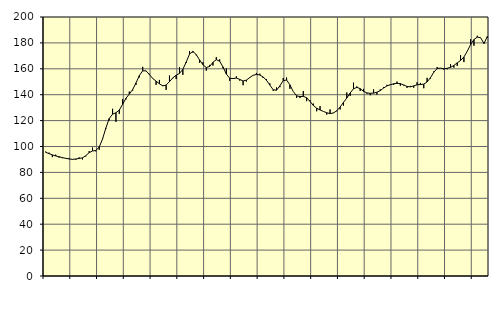
| Category | Piggar | Series 1 |
|---|---|---|
| nan | 96.1 | 95.5 |
| 87.0 | 95.2 | 94.53 |
| 87.0 | 91.8 | 93.51 |
| 87.0 | 93.7 | 92.68 |
| nan | 91.4 | 92.09 |
| 88.0 | 91 | 91.41 |
| 88.0 | 91.1 | 90.87 |
| 88.0 | 91 | 90.38 |
| nan | 90.3 | 90.08 |
| 89.0 | 89.8 | 90.36 |
| 89.0 | 91.6 | 90.73 |
| 89.0 | 90 | 91.27 |
| nan | 92.4 | 92.88 |
| 90.0 | 96.4 | 95.27 |
| 90.0 | 99.2 | 96.56 |
| 90.0 | 96.2 | 96.9 |
| nan | 97.5 | 99.55 |
| 91.0 | 106.2 | 105.83 |
| 91.0 | 113.8 | 114.34 |
| 91.0 | 120.2 | 121.65 |
| nan | 129.1 | 124.95 |
| 92.0 | 119 | 126.06 |
| 92.0 | 125.2 | 128.13 |
| 92.0 | 136.5 | 132.57 |
| nan | 136.4 | 137.27 |
| 93.0 | 142.4 | 140.51 |
| 93.0 | 143.2 | 143.98 |
| 93.0 | 147.7 | 149.12 |
| nan | 153.4 | 154.76 |
| 94.0 | 161.5 | 158.43 |
| 94.0 | 158.3 | 158.4 |
| 94.0 | 156.1 | 155.55 |
| nan | 152.4 | 152.54 |
| 95.0 | 147.6 | 150.48 |
| 95.0 | 151.4 | 148.42 |
| 95.0 | 147.3 | 146.8 |
| nan | 143.7 | 147.49 |
| 96.0 | 154.8 | 150.05 |
| 96.0 | 152.7 | 153.02 |
| 96.0 | 152.1 | 155.06 |
| nan | 161.1 | 156.48 |
| 97.0 | 155.3 | 159.59 |
| 97.0 | 164.5 | 165.21 |
| 97.0 | 173.7 | 171.36 |
| nan | 172.5 | 173.48 |
| 98.0 | 170.4 | 170.95 |
| 98.0 | 164.7 | 166.81 |
| 98.0 | 165 | 163.16 |
| nan | 158.6 | 160.98 |
| 99.0 | 163 | 161.79 |
| 99.0 | 162.5 | 165.01 |
| 99.0 | 169 | 167.05 |
| nan | 167.3 | 165.85 |
| 0.0 | 160.4 | 161.45 |
| 0.0 | 160.3 | 155.91 |
| 0.0 | 150.7 | 152.69 |
| nan | 152.5 | 152.46 |
| 1.0 | 154.2 | 152.82 |
| 1.0 | 150.9 | 151.81 |
| 1.0 | 147.3 | 150.58 |
| nan | 150.2 | 151.28 |
| 2.0 | 153.5 | 153.28 |
| 2.0 | 154.9 | 154.99 |
| 2.0 | 156.8 | 155.65 |
| nan | 156.2 | 155.21 |
| 3.0 | 152.9 | 153.66 |
| 3.0 | 152.1 | 151.13 |
| 3.0 | 148.7 | 147.42 |
| nan | 143 | 143.83 |
| 4.0 | 145.6 | 143.45 |
| 4.0 | 145.8 | 146.86 |
| 4.0 | 152.9 | 150.81 |
| nan | 153.2 | 151.33 |
| 5.0 | 144.5 | 147.61 |
| 5.0 | 142.5 | 142.45 |
| 5.0 | 137.5 | 139.13 |
| nan | 137.5 | 138.54 |
| 6.0 | 142.8 | 138.74 |
| 6.0 | 135 | 137.67 |
| 6.0 | 135.7 | 134.88 |
| nan | 133.1 | 131.7 |
| 7.0 | 127.2 | 129.56 |
| 7.0 | 131.2 | 128.21 |
| 7.0 | 127.1 | 127.08 |
| nan | 124.6 | 126.09 |
| 8.0 | 128.6 | 125.39 |
| 8.0 | 126.1 | 125.88 |
| 8.0 | 127.2 | 127.59 |
| nan | 128.6 | 130.44 |
| 9.0 | 131.6 | 134.05 |
| 9.0 | 141.7 | 137.4 |
| 9.0 | 139.1 | 141.31 |
| nan | 149.3 | 144.55 |
| 10.0 | 146.4 | 145.66 |
| 10.0 | 142.9 | 144.7 |
| 10.0 | 144.5 | 142.64 |
| nan | 140.8 | 141.38 |
| 11.0 | 139.6 | 141.06 |
| 11.0 | 144.1 | 141.22 |
| 11.0 | 140.1 | 141.92 |
| nan | 144.1 | 143.11 |
| 12.0 | 145.9 | 145.12 |
| 12.0 | 147.6 | 146.8 |
| 12.0 | 148.1 | 147.65 |
| nan | 147.6 | 148.42 |
| 13.0 | 150.1 | 148.78 |
| 13.0 | 146.9 | 148.56 |
| 13.0 | 147.1 | 147.52 |
| nan | 145.3 | 146.35 |
| 14.0 | 146.8 | 146.07 |
| 14.0 | 145.4 | 146.78 |
| 14.0 | 149.6 | 147.66 |
| nan | 149.1 | 147.83 |
| 15.0 | 145 | 148.16 |
| 15.0 | 153 | 149.8 |
| 15.0 | 152.4 | 153.1 |
| nan | 158 | 157.35 |
| 16.0 | 161.4 | 160.16 |
| 16.0 | 160.5 | 160.53 |
| 16.0 | 159.4 | 159.99 |
| nan | 159.6 | 160.38 |
| 17.0 | 163.7 | 161.15 |
| 17.0 | 160.9 | 162.57 |
| 17.0 | 162.2 | 164.63 |
| nan | 170.6 | 166.4 |
| 18.0 | 165.2 | 169.12 |
| 18.0 | 173.4 | 173.54 |
| 18.0 | 182.8 | 178.67 |
| nan | 177.8 | 182.58 |
| 19.0 | 185.5 | 184.48 |
| 19.0 | 183.9 | 183.99 |
| 19.0 | 180.4 | 179.54 |
| nan | 183.8 | 184.96 |